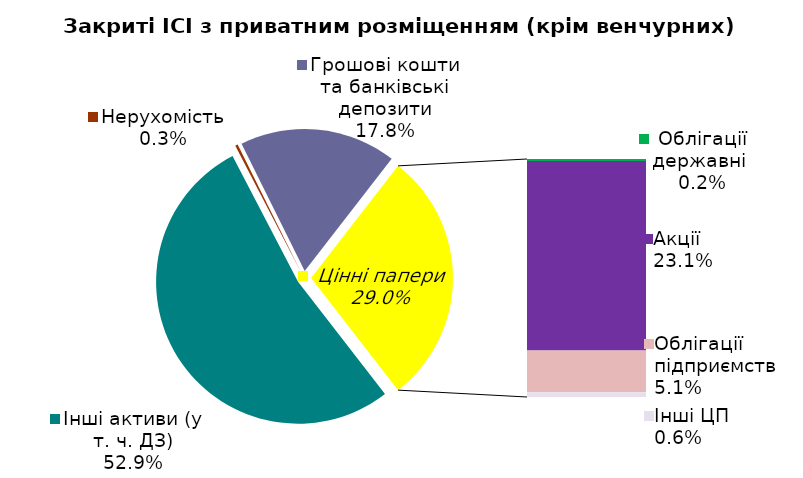
| Category | Series 0 |
|---|---|
| Інші активи (у т. ч. ДЗ) | 0.529 |
| Нерухомість | 0.003 |
| Грошові кошти та банківські депозити | 0.178 |
| Облігації державні  | 0.002 |
| Акцiї | 0.231 |
| Облігації підприємств | 0.051 |
| Інші ЦП | 0.006 |